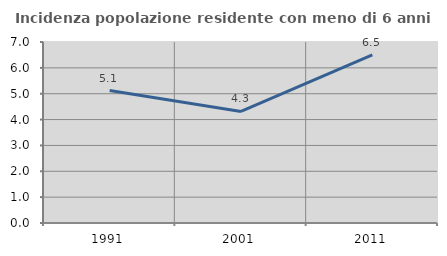
| Category | Incidenza popolazione residente con meno di 6 anni |
|---|---|
| 1991.0 | 5.122 |
| 2001.0 | 4.316 |
| 2011.0 | 6.498 |